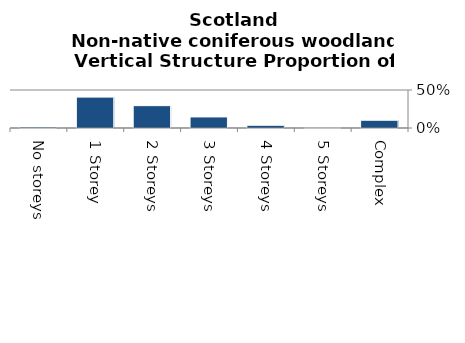
| Category | Non-native coniferous woodland |
|---|---|
| No storeys | 0.014 |
| 1 Storey | 0.406 |
| 2 Storeys | 0.294 |
| 3 Storeys | 0.146 |
| 4 Storeys | 0.036 |
| 5 Storeys | 0.002 |
| Complex | 0.102 |